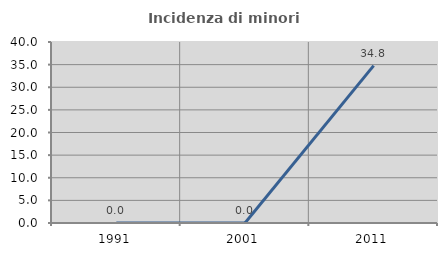
| Category | Incidenza di minori stranieri |
|---|---|
| 1991.0 | 0 |
| 2001.0 | 0 |
| 2011.0 | 34.783 |